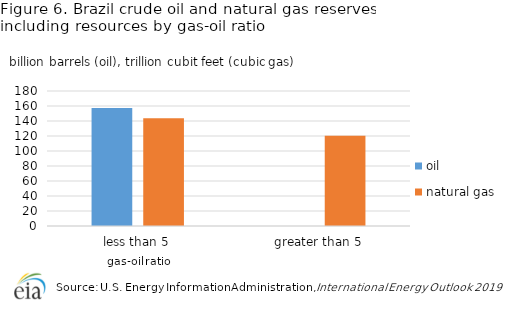
| Category | oil | natural gas |
|---|---|---|
| less than 5 | 157.5 | 143.8 |
| greater than 5 | 0.01 | 120.3 |